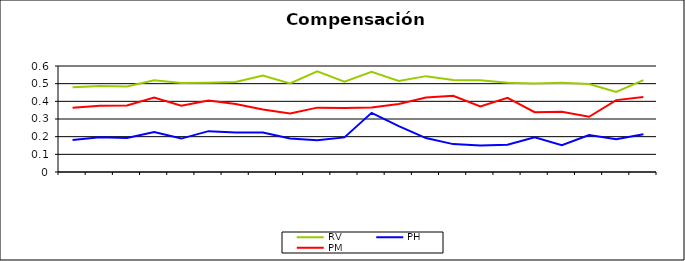
| Category | RV | PH | PM |
|---|---|---|---|
| 0 | 0.479 | 0.181 | 0.364 |
| 1 | 0.487 | 0.196 | 0.375 |
| 2 | 0.484 | 0.192 | 0.376 |
| 3 | 0.52 | 0.226 | 0.421 |
| 4 | 0.504 | 0.189 | 0.375 |
| 5 | 0.506 | 0.231 | 0.404 |
| 6 | 0.51 | 0.224 | 0.384 |
| 7 | 0.546 | 0.223 | 0.353 |
| 8 | 0.501 | 0.19 | 0.331 |
| 9 | 0.57 | 0.18 | 0.364 |
| 10 | 0.511 | 0.196 | 0.363 |
| 11 | 0.567 | 0.335 | 0.365 |
| 12 | 0.515 | 0.26 | 0.385 |
| 13 | 0.543 | 0.192 | 0.422 |
| 14 | 0.52 | 0.158 | 0.431 |
| 15 | 0.519 | 0.15 | 0.371 |
| 16 | 0.505 | 0.154 | 0.42 |
| 17 | 0.501 | 0.196 | 0.339 |
| 18 | 0.506 | 0.151 | 0.341 |
| 19 | 0.498 | 0.209 | 0.313 |
| 20 | 0.453 | 0.186 | 0.407 |
| 21 | 0.52 | 0.213 | 0.424 |